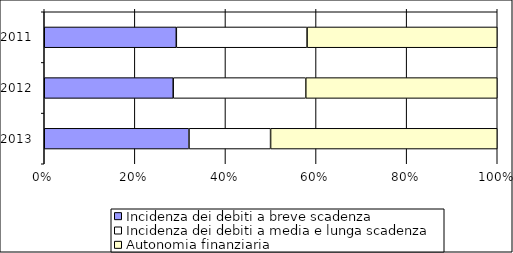
| Category | Incidenza dei debiti a breve scadenza | Incidenza dei debiti a media e lunga scadenza | Autonomia finanziaria |
|---|---|---|---|
| 2011.0 | 0.292 | 0.289 | 0.42 |
| 2012.0 | 0.285 | 0.293 | 0.423 |
| 2013.0 | 0.32 | 0.18 | 0.5 |